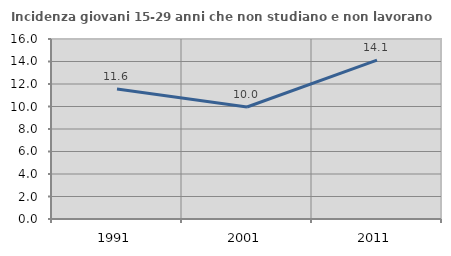
| Category | Incidenza giovani 15-29 anni che non studiano e non lavorano  |
|---|---|
| 1991.0 | 11.557 |
| 2001.0 | 9.955 |
| 2011.0 | 14.118 |